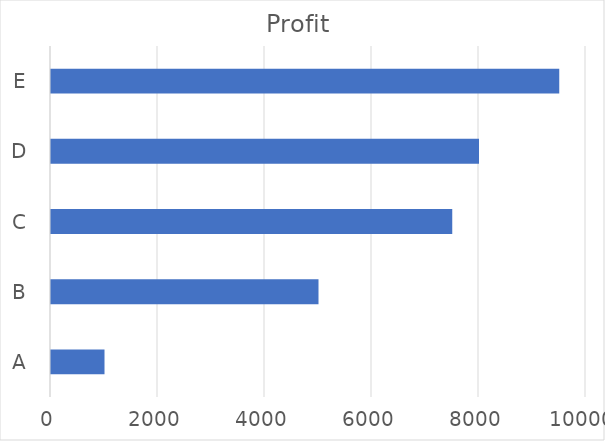
| Category | Profit |
|---|---|
| A | 1000 |
| B | 5000 |
| C | 7500 |
| D | 8000 |
| E | 9500 |